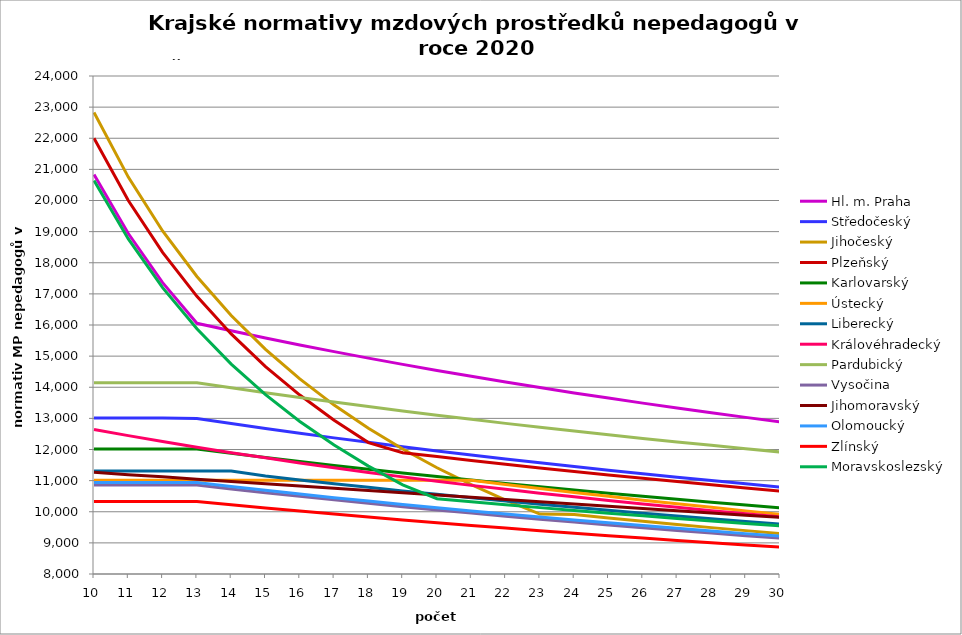
| Category | Hl. m. Praha | Středočeský | Jihočeský | Plzeňský | Karlovarský  | Ústecký   | Liberecký | Královéhradecký | Pardubický | Vysočina | Jihomoravský | Olomoucký | Zlínský | Moravskoslezský |
|---|---|---|---|---|---|---|---|---|---|---|---|---|---|---|
| 10.0 | 20832 | 13011.111 | 22826.448 | 21998.4 | 12015.95 | 11012.324 | 11306.231 | 12641.778 | 14143.911 | 10858.532 | 11272.666 | 10937.037 | 10332.651 | 20640 |
| 11.0 | 18938.182 | 13011.111 | 20751.316 | 19998.545 | 12015.95 | 11012.324 | 11306.231 | 12445.114 | 14143.911 | 10858.532 | 11191.909 | 10937.037 | 10332.651 | 18763.636 |
| 12.0 | 17360 | 13011.111 | 19022.04 | 18332 | 12015.95 | 11012.324 | 11306.231 | 12254.476 | 14143.911 | 10858.532 | 11121.608 | 10937.037 | 10332.651 | 17200 |
| 13.0 | 16054.056 | 12995.318 | 17558.806 | 16921.846 | 12016.057 | 11012.324 | 11306.231 | 12069.59 | 14144.036 | 10858.532 | 11047.587 | 10937.037 | 10328.67 | 15876.923 |
| 14.0 | 15814.598 | 12832.408 | 16304.606 | 15713.143 | 11878.17 | 11012.324 | 11306.231 | 11895.725 | 13981.73 | 10733.953 | 10974.545 | 10808.366 | 10223.34 | 14742.857 |
| 15.0 | 15583.483 | 12674.618 | 15217.632 | 14665.6 | 11744.327 | 11012.324 | 11146.971 | 11732.172 | 13824.185 | 10613.014 | 10902.463 | 10687.29 | 10120.838 | 13760 |
| 16.0 | 15360.294 | 12521.721 | 14266.53 | 13749 | 11614.362 | 11012.324 | 11022.551 | 11567.826 | 13671.203 | 10495.566 | 10826.906 | 10568.896 | 10021.06 | 12900 |
| 17.0 | 15144.642 | 12373.503 | 13427.322 | 12940.235 | 11488.118 | 11012.324 | 10901.716 | 11413.107 | 13522.602 | 10381.466 | 10756.744 | 10453.097 | 9923.905 | 12141.176 |
| 18.0 | 14936.16 | 12229.765 | 12681.36 | 12221.333 | 11365.446 | 11012.324 | 10784.322 | 11262.473 | 13378.206 | 10270.583 | 10683.186 | 10344.12 | 9829.278 | 11466.667 |
| 19.0 | 14734.507 | 12090.316 | 12013.92 | 11898.745 | 11246.206 | 11012.324 | 10670.232 | 11120.591 | 13237.849 | 10162.789 | 10610.627 | 10233.168 | 9737.088 | 10863.158 |
| 20.0 | 14539.363 | 11954.977 | 11413.224 | 11771.404 | 11130.263 | 11012.324 | 10559.318 | 10982.239 | 13101.374 | 10057.965 | 10534.867 | 10128.706 | 9647.249 | 10417.508 |
| 21.0 | 14350.428 | 11823.58 | 10869.737 | 11646.76 | 11017.493 | 11012.324 | 10451.456 | 10847.288 | 12968.632 | 9956.354 | 10464.303 | 10026.354 | 9559.679 | 10320.021 |
| 22.0 | 14167.419 | 11695.965 | 10375.658 | 11524.728 | 10907.775 | 10878.261 | 10346.53 | 10720.101 | 12839.483 | 9857.128 | 10390.61 | 9926.05 | 9474.299 | 10225.03 |
| 23.0 | 13990.072 | 11571.98 | 9924.543 | 11405.226 | 10800.994 | 10747.423 | 10244.431 | 10595.861 | 12713.792 | 9760.547 | 10317.949 | 9831.629 | 9391.036 | 10132.448 |
| 24.0 | 13818.136 | 11451.483 | 9908.446 | 11292.813 | 10697.043 | 10619.694 | 10145.052 | 10478.756 | 12591.433 | 9666.515 | 10246.296 | 9735.165 | 9309.817 | 10042.193 |
| 25.0 | 13651.376 | 11334.338 | 9798.737 | 11182.595 | 10595.819 | 10494.966 | 10048.296 | 10360.016 | 12472.282 | 9575.271 | 10175.632 | 9644.323 | 9230.575 | 9954.184 |
| 26.0 | 13489.572 | 11220.416 | 9692.54 | 11074.507 | 10497.225 | 10373.134 | 9954.066 | 10248.038 | 12356.227 | 9486.059 | 10105.936 | 9555.162 | 9153.244 | 9868.346 |
| 27.0 | 13332.514 | 11109.596 | 9589.707 | 10968.488 | 10401.166 | 10258.303 | 9862.274 | 10142.472 | 12243.157 | 9399.131 | 10033.396 | 9467.634 | 9077.763 | 9784.606 |
| 28.0 | 13180.005 | 11001.762 | 9490.097 | 10864.48 | 10307.554 | 10141.873 | 9772.832 | 10035.123 | 12132.967 | 9314.722 | 9961.89 | 9381.694 | 9004.073 | 9702.896 |
| 29.0 | 13031.859 | 10896.803 | 9393.578 | 10766.641 | 10216.305 | 10028.056 | 9685.66 | 9937.733 | 12025.558 | 9232.123 | 9891.397 | 9297.301 | 8932.115 | 9623.149 |
| 30.0 | 12887.899 | 10794.617 | 9300.023 | 10666.408 | 10127.339 | 9916.766 | 9600.68 | 9838.432 | 11920.836 | 9151.884 | 9818.262 | 9217.837 | 8861.837 | 9545.303 |